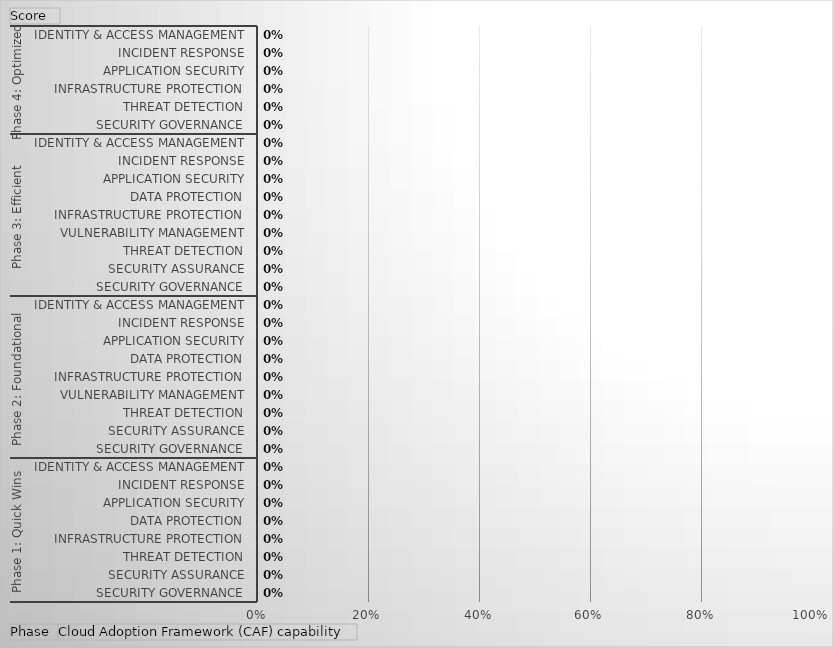
| Category | Total |
|---|---|
| 0 | 0 |
| 1 | 0 |
| 2 | 0 |
| 3 | 0 |
| 4 | 0 |
| 5 | 0 |
| 6 | 0 |
| 7 | 0 |
| 8 | 0 |
| 9 | 0 |
| 10 | 0 |
| 11 | 0 |
| 12 | 0 |
| 13 | 0 |
| 14 | 0 |
| 15 | 0 |
| 16 | 0 |
| 17 | 0 |
| 18 | 0 |
| 19 | 0 |
| 20 | 0 |
| 21 | 0 |
| 22 | 0 |
| 23 | 0 |
| 24 | 0 |
| 25 | 0 |
| 26 | 0 |
| 27 | 0 |
| 28 | 0 |
| 29 | 0 |
| 30 | 0 |
| 31 | 0 |